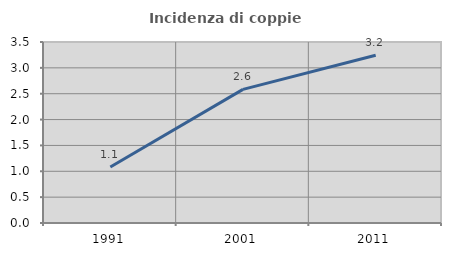
| Category | Incidenza di coppie miste |
|---|---|
| 1991.0 | 1.082 |
| 2001.0 | 2.583 |
| 2011.0 | 3.245 |